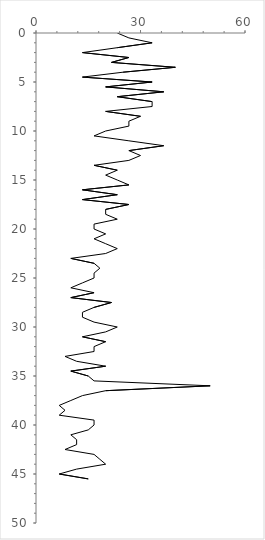
| Category | Series 0 |
|---|---|
| 23.333333333333336 | 0 |
| 26.666666666666668 | 0.5 |
| 33.33333333333333 | 1 |
| 23.333333333333332 | 1.5 |
| 13.333333333333334 | 2 |
| 26.666666666666668 | 2.5 |
| 21.666666666666668 | 3 |
| 40.00000000000001 | 3.5 |
| 25.0 | 4 |
| 13.333333333333334 | 4.5 |
| 33.33333333333333 | 5 |
| 20.000000000000004 | 5.5 |
| 36.66666666666667 | 6 |
| 23.333333333333332 | 6.5 |
| 33.33333333333333 | 7 |
| 33.33333333333333 | 7.5 |
| 20.0 | 8 |
| 30.000000000000004 | 8.5 |
| 26.666666666666668 | 9 |
| 26.666666666666668 | 9.5 |
| 20.0 | 10 |
| 16.666666666666664 | 10.5 |
| 26.666666666666668 | 11 |
| 36.66666666666667 | 11.5 |
| 26.666666666666668 | 12 |
| 30.0 | 12.5 |
| 26.666666666666668 | 13 |
| 16.666666666666664 | 13.5 |
| 23.333333333333332 | 14 |
| 20.000000000000004 | 14.5 |
| 23.333333333333332 | 15 |
| 26.666666666666668 | 15.5 |
| 13.333333333333334 | 16 |
| 23.333333333333332 | 16.5 |
| 13.333333333333334 | 17 |
| 26.666666666666668 | 17.5 |
| 20.000000000000004 | 18 |
| 20.000000000000004 | 18.5 |
| 23.333333333333332 | 19 |
| 16.666666666666664 | 19.5 |
| 16.666666666666664 | 20 |
| 20.0 | 20.5 |
| 16.666666666666664 | 21 |
| 20.0 | 21.5 |
| 23.333333333333332 | 22 |
| 20.0 | 22.5 |
| 10.000000000000002 | 23 |
| 16.666666666666664 | 23.5 |
| 18.333333333333336 | 24 |
| 16.666666666666664 | 24.5 |
| 16.666666666666664 | 25 |
| 13.333333333333334 | 25.5 |
| 10.000000000000002 | 26 |
| 16.666666666666664 | 26.5 |
| 10.000000000000002 | 27 |
| 21.66666666666667 | 27.5 |
| 16.666666666666664 | 28 |
| 13.333333333333334 | 28.5 |
| 13.333333333333334 | 29 |
| 16.666666666666664 | 29.5 |
| 23.333333333333336 | 30 |
| 20.0 | 30.5 |
| 13.333333333333334 | 31 |
| 20.000000000000004 | 31.5 |
| 16.666666666666664 | 32 |
| 16.666666666666664 | 32.5 |
| 8.333333333333332 | 33 |
| 11.666666666666668 | 33.5 |
| 20.000000000000004 | 34 |
| 10.000000000000002 | 34.5 |
| 15.0 | 35 |
| 16.666666666666664 | 35.5 |
| 50.0 | 36 |
| 20.000000000000004 | 36.5 |
| 13.333333333333334 | 37 |
| 10.000000000000002 | 37.5 |
| 6.666666666666667 | 38 |
| 8.333333333333332 | 38.5 |
| 6.666666666666667 | 39 |
| 16.666666666666664 | 39.5 |
| 16.666666666666664 | 40 |
| 15.0 | 40.5 |
| 10.000000000000002 | 41 |
| 11.666666666666668 | 41.5 |
| 11.666666666666668 | 42 |
| 8.333333333333332 | 42.5 |
| 16.666666666666664 | 43 |
| 18.333333333333336 | 43.5 |
| 20.000000000000004 | 44 |
| 11.666666666666668 | 44.5 |
| 6.666666666666667 | 45 |
| 15.0 | 45.5 |